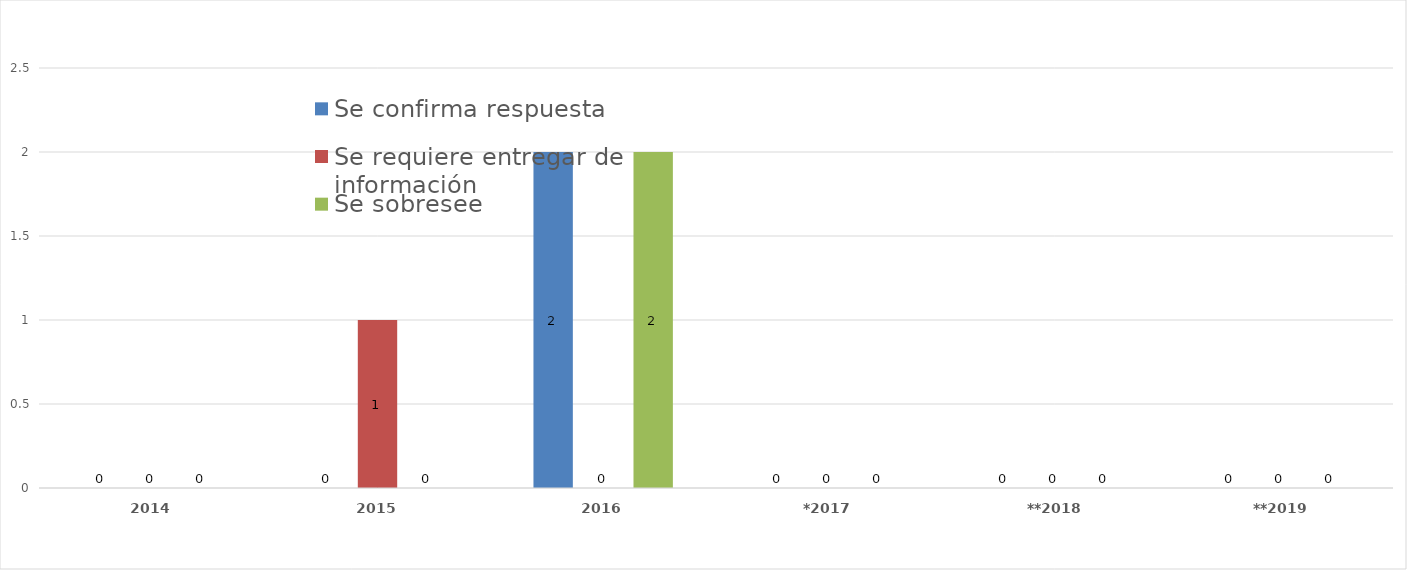
| Category | Se confirma respuesta | Se requiere entregar de información  | Se sobresee  |
|---|---|---|---|
| 2014 | 0 | 0 | 0 |
| 2015 | 0 | 1 | 0 |
| 2016 | 2 | 0 | 2 |
| *2017 | 0 | 0 | 0 |
| **2018 | 0 | 0 | 0 |
| **2019 | 0 | 0 | 0 |